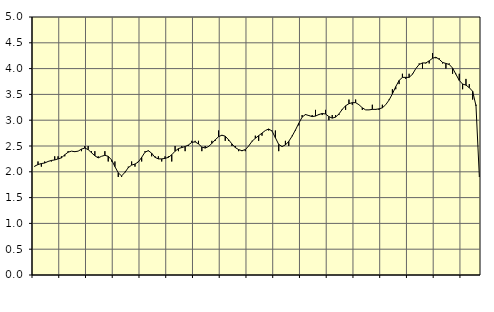
| Category | Piggar | Series 1 |
|---|---|---|
| nan | 2.1 | 2.11 |
| 87.0 | 2.2 | 2.14 |
| 87.0 | 2.1 | 2.16 |
| 87.0 | 2.2 | 2.17 |
| nan | 2.2 | 2.2 |
| 88.0 | 2.2 | 2.22 |
| 88.0 | 2.3 | 2.23 |
| 88.0 | 2.3 | 2.25 |
| nan | 2.3 | 2.27 |
| 89.0 | 2.3 | 2.33 |
| 89.0 | 2.4 | 2.38 |
| 89.0 | 2.4 | 2.4 |
| nan | 2.4 | 2.39 |
| 90.0 | 2.4 | 2.4 |
| 90.0 | 2.4 | 2.44 |
| 90.0 | 2.5 | 2.46 |
| nan | 2.5 | 2.43 |
| 91.0 | 2.4 | 2.37 |
| 91.0 | 2.4 | 2.31 |
| 91.0 | 2.3 | 2.27 |
| nan | 2.3 | 2.3 |
| 92.0 | 2.4 | 2.32 |
| 92.0 | 2.2 | 2.3 |
| 92.0 | 2.2 | 2.23 |
| nan | 2.2 | 2.1 |
| 93.0 | 1.9 | 1.98 |
| 93.0 | 1.9 | 1.92 |
| 93.0 | 2 | 1.99 |
| nan | 2.1 | 2.08 |
| 94.0 | 2.2 | 2.13 |
| 94.0 | 2.1 | 2.15 |
| 94.0 | 2.2 | 2.19 |
| nan | 2.2 | 2.28 |
| 95.0 | 2.4 | 2.38 |
| 95.0 | 2.4 | 2.41 |
| 95.0 | 2.3 | 2.36 |
| nan | 2.3 | 2.28 |
| 96.0 | 2.3 | 2.25 |
| 96.0 | 2.2 | 2.25 |
| 96.0 | 2.3 | 2.26 |
| nan | 2.3 | 2.28 |
| 97.0 | 2.2 | 2.33 |
| 97.0 | 2.5 | 2.4 |
| 97.0 | 2.4 | 2.45 |
| nan | 2.5 | 2.47 |
| 98.0 | 2.4 | 2.49 |
| 98.0 | 2.5 | 2.52 |
| 98.0 | 2.6 | 2.57 |
| nan | 2.6 | 2.58 |
| 99.0 | 2.6 | 2.54 |
| 99.0 | 2.4 | 2.48 |
| 99.0 | 2.5 | 2.46 |
| nan | 2.5 | 2.49 |
| 0.0 | 2.6 | 2.55 |
| 0.0 | 2.6 | 2.62 |
| 0.0 | 2.8 | 2.68 |
| nan | 2.7 | 2.71 |
| 1.0 | 2.6 | 2.69 |
| 1.0 | 2.6 | 2.62 |
| 1.0 | 2.5 | 2.54 |
| nan | 2.5 | 2.47 |
| 2.0 | 2.4 | 2.43 |
| 2.0 | 2.4 | 2.41 |
| 2.0 | 2.4 | 2.43 |
| nan | 2.5 | 2.5 |
| 3.0 | 2.6 | 2.59 |
| 3.0 | 2.7 | 2.65 |
| 3.0 | 2.6 | 2.7 |
| nan | 2.7 | 2.75 |
| 4.0 | 2.8 | 2.8 |
| 4.0 | 2.8 | 2.83 |
| 4.0 | 2.8 | 2.79 |
| nan | 2.8 | 2.66 |
| 5.0 | 2.4 | 2.53 |
| 5.0 | 2.5 | 2.49 |
| 5.0 | 2.6 | 2.52 |
| nan | 2.5 | 2.59 |
| 6.0 | 2.7 | 2.69 |
| 6.0 | 2.8 | 2.81 |
| 6.0 | 2.9 | 2.94 |
| nan | 3.1 | 3.06 |
| 7.0 | 3.1 | 3.11 |
| 7.0 | 3.1 | 3.09 |
| 7.0 | 3.1 | 3.07 |
| nan | 3.2 | 3.08 |
| 8.0 | 3.1 | 3.11 |
| 8.0 | 3.1 | 3.13 |
| 8.0 | 3.2 | 3.12 |
| nan | 3 | 3.07 |
| 9.0 | 3.1 | 3.04 |
| 9.0 | 3.1 | 3.06 |
| 9.0 | 3.1 | 3.12 |
| nan | 3.2 | 3.21 |
| 10.0 | 3.2 | 3.28 |
| 10.0 | 3.4 | 3.32 |
| 10.0 | 3.3 | 3.34 |
| nan | 3.4 | 3.34 |
| 11.0 | 3.3 | 3.3 |
| 11.0 | 3.2 | 3.24 |
| 11.0 | 3.2 | 3.2 |
| nan | 3.2 | 3.2 |
| 12.0 | 3.3 | 3.21 |
| 12.0 | 3.2 | 3.21 |
| 12.0 | 3.2 | 3.22 |
| nan | 3.3 | 3.24 |
| 13.0 | 3.3 | 3.3 |
| 13.0 | 3.4 | 3.39 |
| 13.0 | 3.6 | 3.51 |
| nan | 3.6 | 3.65 |
| 14.0 | 3.7 | 3.77 |
| 14.0 | 3.9 | 3.83 |
| 14.0 | 3.8 | 3.83 |
| nan | 3.9 | 3.83 |
| 15.0 | 3.9 | 3.89 |
| 15.0 | 4 | 4 |
| 15.0 | 4.1 | 4.08 |
| nan | 4 | 4.11 |
| 16.0 | 4.1 | 4.11 |
| 16.0 | 4.1 | 4.15 |
| 16.0 | 4.3 | 4.2 |
| nan | 4.2 | 4.22 |
| 17.0 | 4.2 | 4.18 |
| 17.0 | 4.1 | 4.12 |
| 17.0 | 4 | 4.1 |
| nan | 4.1 | 4.08 |
| 18.0 | 3.9 | 4.01 |
| 18.0 | 3.9 | 3.89 |
| 18.0 | 3.9 | 3.77 |
| nan | 3.6 | 3.7 |
| 19.0 | 3.8 | 3.68 |
| 19.0 | 3.7 | 3.63 |
| 19.0 | 3.4 | 3.56 |
| nan | 3.3 | 3.28 |
| 20.0 | 1.9 | 1.91 |